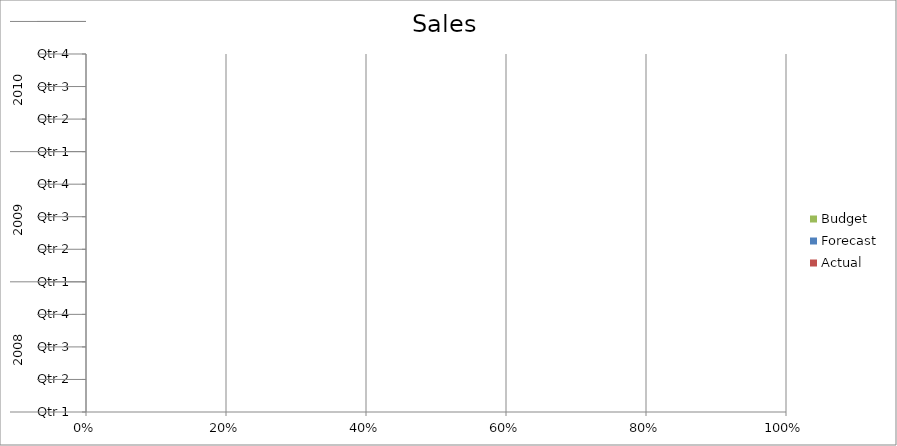
| Category | Budget | Forecast | Actual |
|---|---|---|---|
| 0 | 2280 | 1100 | 2980 |
| 1 | 1790 | 3110 | 1870 |
| 2 | 1150 | 1230 | 2810 |
| 3 | 2470 | 940 | 790 |
| 4 | 3350 | 510 | 2980 |
| 5 | 890 | 3060 | 1250 |
| 6 | 1760 | 3420 | 3270 |
| 7 | 3080 | 2280 | 810 |
| 8 | 1390 | 1430 | 3230 |
| 9 | 3080 | 2730 | 3060 |
| 10 | 1570 | 2580 | 1320 |
| 11 | 2870 | 760 | 2270 |